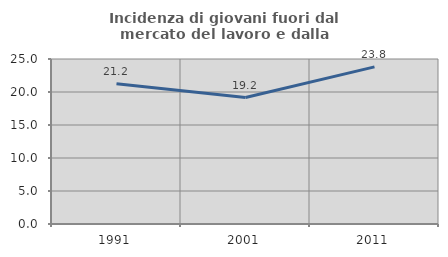
| Category | Incidenza di giovani fuori dal mercato del lavoro e dalla formazione  |
|---|---|
| 1991.0 | 21.241 |
| 2001.0 | 19.164 |
| 2011.0 | 23.801 |